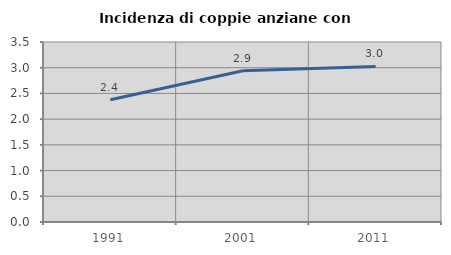
| Category | Incidenza di coppie anziane con figli |
|---|---|
| 1991.0 | 2.377 |
| 2001.0 | 2.942 |
| 2011.0 | 3.024 |